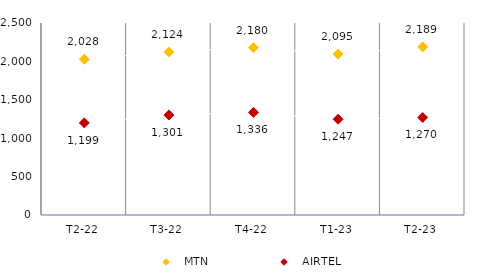
| Category | MTN | AIRTEL |
|---|---|---|
| T2-22 | 2027.698 | 1199.212 |
| T3-22 | 2123.675 | 1301.444 |
| T4-22 | 2180.143 | 1336.495 |
| T1-23 | 2095.467 | 1247.337 |
| T2-23 | 2189.124 | 1270.008 |